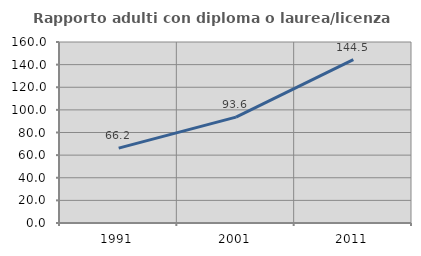
| Category | Rapporto adulti con diploma o laurea/licenza media  |
|---|---|
| 1991.0 | 66.226 |
| 2001.0 | 93.635 |
| 2011.0 | 144.493 |